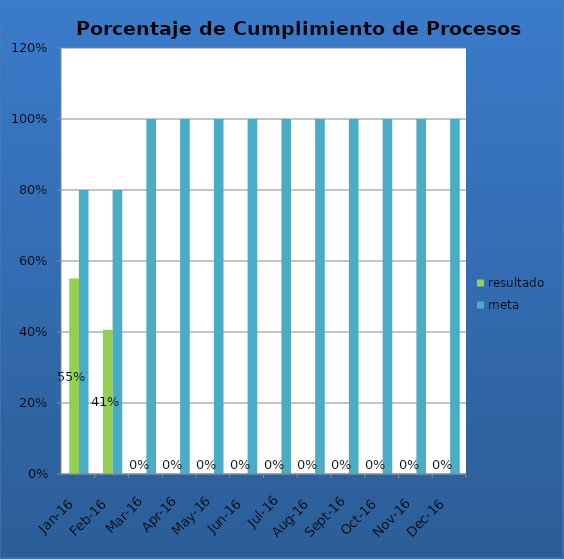
| Category | resultado | meta |
|---|---|---|
| ene-16 | 0.551 | 0.8 |
| feb-16 | 0.406 | 0.8 |
| mar-16 | 0 | 1 |
| abr-16 | 0 | 1 |
| may-16 | 0 | 1 |
| jun-16 | 0 | 1 |
| jul-16 | 0 | 1 |
| ago-16 | 0 | 1 |
| sep-16 | 0 | 1 |
| oct-16 | 0 | 1 |
| nov-16 | 0 | 1 |
| dic-16 | 0 | 1 |